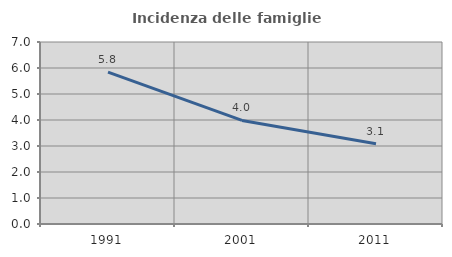
| Category | Incidenza delle famiglie numerose |
|---|---|
| 1991.0 | 5.844 |
| 2001.0 | 3.984 |
| 2011.0 | 3.09 |